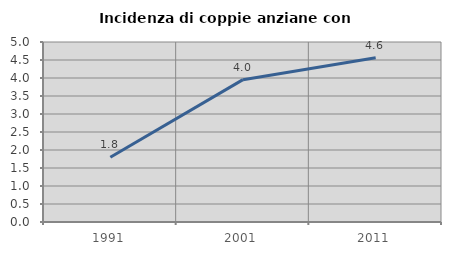
| Category | Incidenza di coppie anziane con figli |
|---|---|
| 1991.0 | 1.799 |
| 2001.0 | 3.954 |
| 2011.0 | 4.56 |